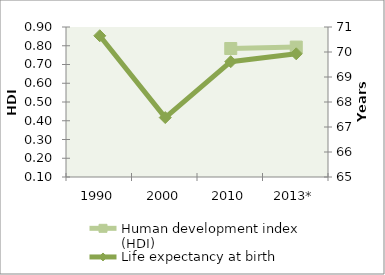
| Category | Human development index (HDI) |
|---|---|
| 1990 | 0 |
| 2000 | 0 |
| 2010 | 0.785 |
| 2013* | 0.793 |